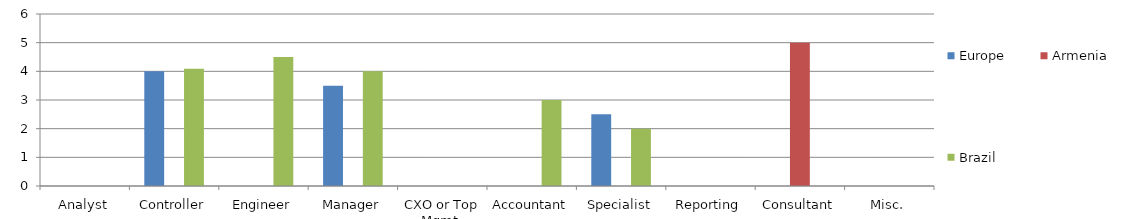
| Category | Europe | Armenia | Brazil | 0 |
|---|---|---|---|---|
| Analyst | 0 | 0 | 0 |  |
| Controller | 4 | 0 | 4.091 |  |
| Engineer | 0 | 0 | 4.5 |  |
| Manager | 3.5 | 0 | 4 |  |
| CXO or Top Mgmt. | 0 | 0 | 0 |  |
| Accountant | 0 | 0 | 3 |  |
| Specialist | 2.5 | 0 | 2 |  |
| Reporting | 0 | 0 | 0 |  |
| Consultant | 0 | 5 | 0 |  |
| Misc. | 0 | 0 | 0 |  |